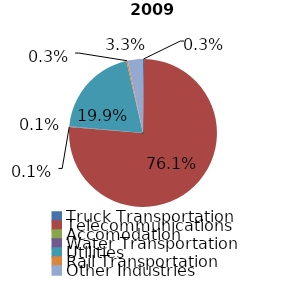
| Category | Series 0 |
|---|---|
| Truck Transportation | 1596638 |
| Telecommunications | 509600377 |
| Accomodation | 491874 |
| Water Transportation | 741161 |
| Utilities | 133454345 |
| Rail Transportation | 1944152 |
| Other Industries | 22241282 |